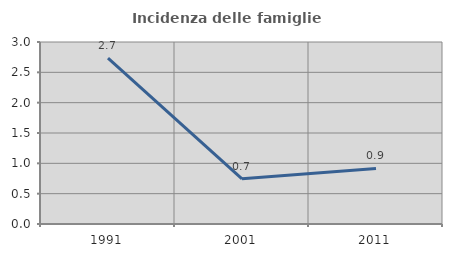
| Category | Incidenza delle famiglie numerose |
|---|---|
| 1991.0 | 2.734 |
| 2001.0 | 0.744 |
| 2011.0 | 0.915 |